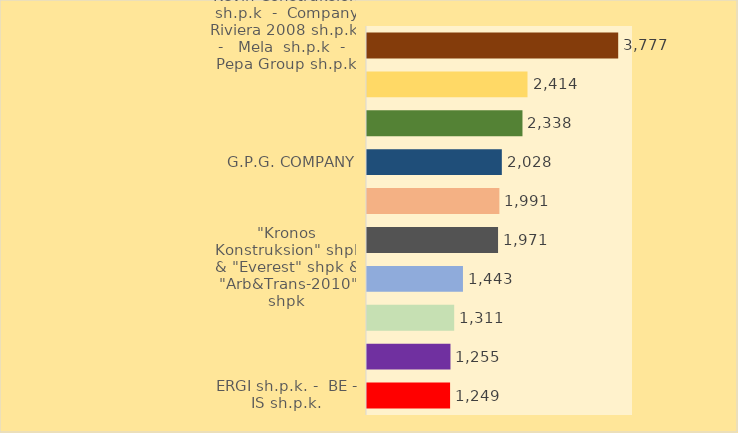
| Category | Oferta Fituese
në mln Lekë |
|---|---|
| Kevin Construksion sh.p.k  -  Company Riviera 2008 sh.p.k  -   Mela  sh.p.k  -   Pepa Group sh.p.k | 3777.43 |
| “Ante-Group” sh.p.k - “Ferro Beton&Construction Co” sh.p.k | 2413.537 |
| GJIKURIA | 2337.904 |
| G.P.G. COMPANY | 2027.585 |
| SALILLARI SHPK | 1990.642 |
| 2T SHPK & VELLEZERIT HYSA SHPK & ADRIATIK SHPK | 1970.731 |
| "Kronos Konstruksion" shpk & "Everest" shpk & "Arb&Trans-2010" shpk | 1443.046 |
| Erzeni/Sh Shpk - Senka Shpk - Dajti Park 2007 Shpk | 1310.992 |
| G.P.G Company shpk & Shendelli shpk & NG Structures shpk | 1255.222 |
| ERGI sh.p.k. -  BE - IS sh.p.k. | 1249.408 |